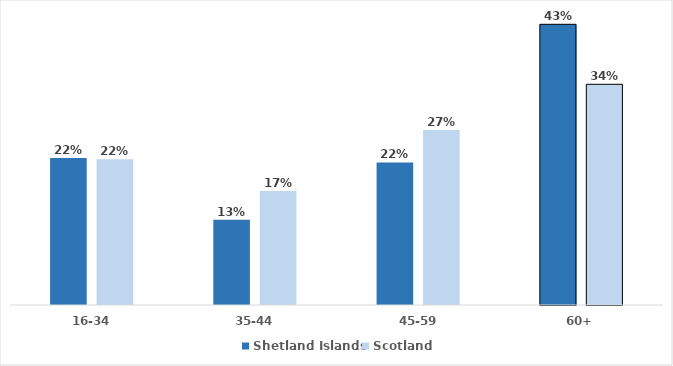
| Category | Shetland Islands | Scotland |
|---|---|---|
| 16-34 | 0.224 | 0.222 |
| 35-44 | 0.13 | 0.174 |
| 45-59 | 0.218 | 0.267 |
| 60+ | 0.428 | 0.337 |